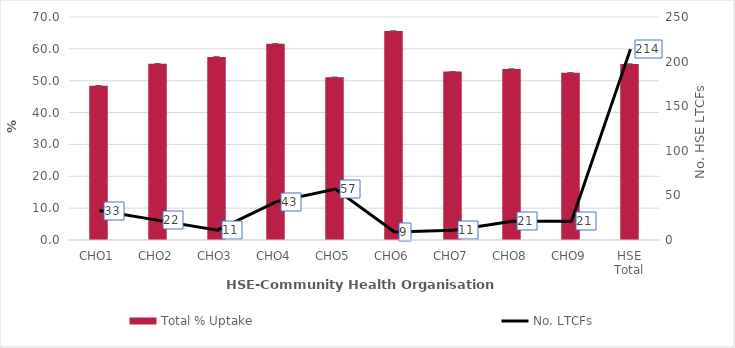
| Category | Total % Uptake |
|---|---|
| 0 | 48.446 |
| 1 | 55.328 |
| 2 | 57.478 |
| 3 | 61.614 |
| 4 | 51.095 |
| 5 | 65.613 |
| 6 | 52.884 |
| 7 | 53.668 |
| 8 | 52.47 |
| 9 | 55.233 |